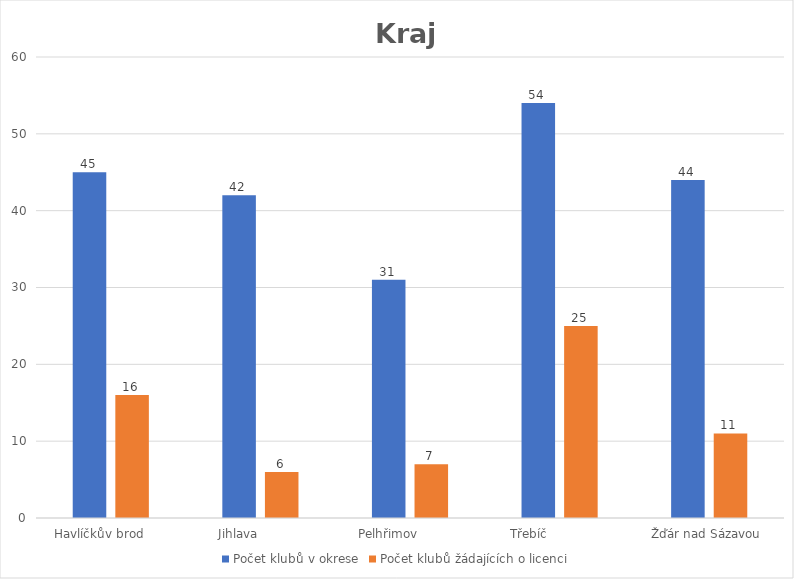
| Category | Počet klubů v okrese | Počet klubů žádajících o licenci |
|---|---|---|
| Havlíčkův brod      | 45 | 16 |
| Jihlava            | 42 | 6 |
| Pelhřimov            | 31 | 7 |
| Třebíč                | 54 | 25 |
| Žďár nad Sázavou  | 44 | 11 |